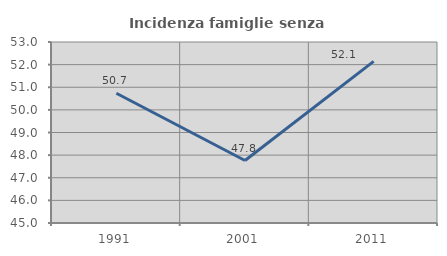
| Category | Incidenza famiglie senza nuclei |
|---|---|
| 1991.0 | 50.735 |
| 2001.0 | 47.761 |
| 2011.0 | 52.143 |